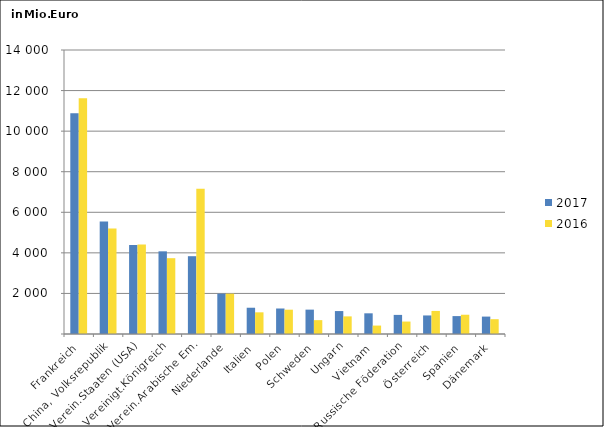
| Category | 2017 | 2016 |
|---|---|---|
| Frankreich | 10877.158 | 11624.368 |
| China, Volksrepublik | 5546.894 | 5198.435 |
| Verein.Staaten (USA) | 4384.761 | 4406.845 |
| Vereinigt.Königreich | 4075.323 | 3737.251 |
| Verein.Arabische Em. | 3835.478 | 7160.71 |
| Niederlande | 1987.647 | 1987.775 |
| Italien | 1294.719 | 1068.44 |
| Polen | 1256.947 | 1198.491 |
| Schweden | 1201.033 | 683.428 |
| Ungarn | 1130.893 | 868.191 |
| Vietnam | 1019.664 | 415.287 |
| Russische Föderation | 941.811 | 613.292 |
| Österreich | 914.573 | 1136.792 |
| Spanien | 882.836 | 949.547 |
| Dänemark | 858.154 | 730.184 |